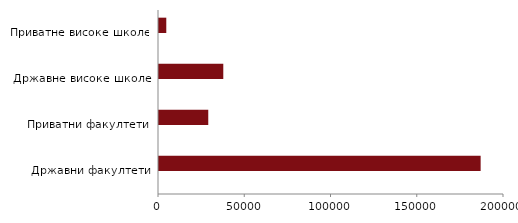
| Category | Series 0 | Series 1 |
|---|---|---|
|  Државни факултети |  | 186460 |
| Приватни факултети |  | 28558 |
| Државне високе школе |  | 37268 |
| Приватне високе школе |  | 4223 |